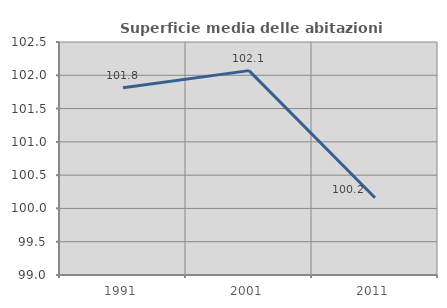
| Category | Superficie media delle abitazioni occupate |
|---|---|
| 1991.0 | 101.813 |
| 2001.0 | 102.07 |
| 2011.0 | 100.16 |